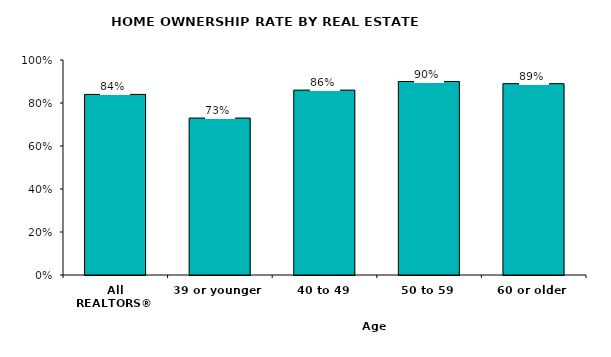
| Category | Series 0 |
|---|---|
| All REALTORS® | 84 |
| 39 or younger | 73 |
| 40 to 49 | 86 |
| 50 to 59 | 90 |
| 60 or older | 89 |